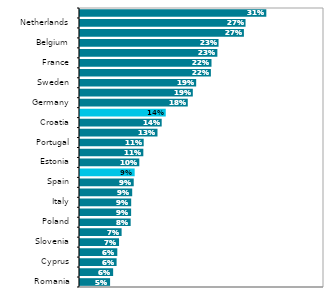
| Category | Series 0 |
|---|---|
| Romania | 0.051 |
| Slovakia | 0.056 |
| Cyprus | 0.062 |
| Bulgaria | 0.063 |
| Slovenia | 0.066 |
| Hungary | 0.07 |
| Poland | 0.085 |
| Latvia | 0.085 |
| Italy | 0.086 |
| Austria | 0.087 |
| Spain | 0.09 |
| Czechia | 0.091 |
| Estonia | 0.099 |
| Lithuania | 0.105 |
| Portugal | 0.106 |
| Greece | 0.129 |
| Croatia | 0.136 |
| EU27 | 0.142 |
| Germany | 0.178 |
| Luxembourg  | 0.187 |
| Sweden | 0.192 |
| Finland | 0.216 |
| France | 0.217 |
| Ireland | 0.227 |
| Belgium | 0.229 |
| Denmark | 0.27 |
| Netherlands | 0.273 |
| Malta | 0.307 |